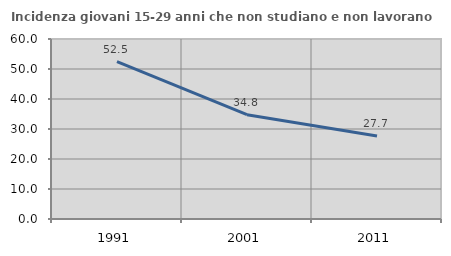
| Category | Incidenza giovani 15-29 anni che non studiano e non lavorano  |
|---|---|
| 1991.0 | 52.459 |
| 2001.0 | 34.783 |
| 2011.0 | 27.673 |